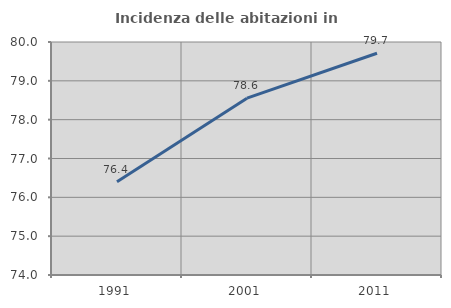
| Category | Incidenza delle abitazioni in proprietà  |
|---|---|
| 1991.0 | 76.402 |
| 2001.0 | 78.554 |
| 2011.0 | 79.709 |